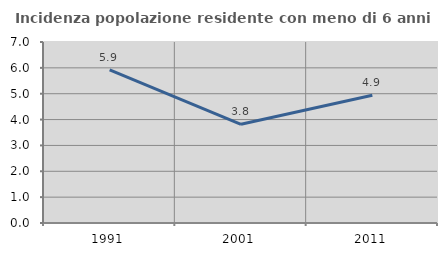
| Category | Incidenza popolazione residente con meno di 6 anni |
|---|---|
| 1991.0 | 5.926 |
| 2001.0 | 3.818 |
| 2011.0 | 4.938 |